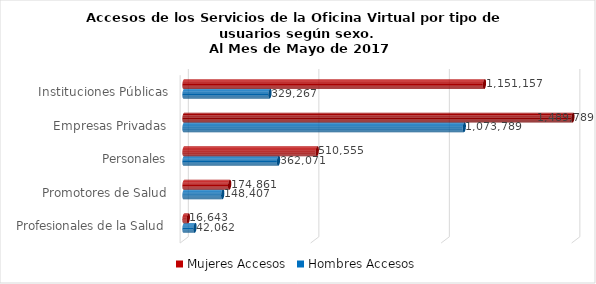
| Category | Mujeres | Hombres |
|---|---|---|
| Instituciones Públicas | 1151157 | 329267 |
| Empresas Privadas | 1489789 | 1073789 |
| Personales | 510555 | 362071 |
| Promotores de Salud | 174861 | 148407 |
| Profesionales de la Salud | 16643 | 42062 |